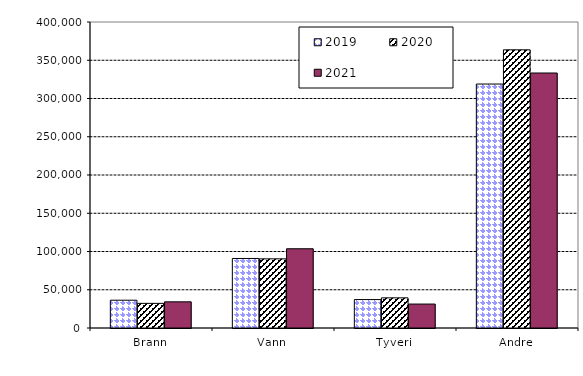
| Category | 2019 | 2020 | 2021 |
|---|---|---|---|
| Brann | 36333.151 | 32197.085 | 34228.25 |
| Vann | 90885.235 | 90395.745 | 103582.855 |
| Tyveri | 37173.079 | 39406.155 | 31303.148 |
| Andre | 318893.277 | 363630.106 | 333320.571 |